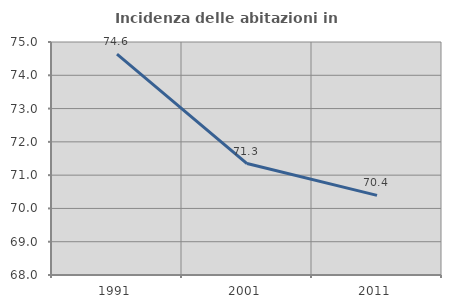
| Category | Incidenza delle abitazioni in proprietà  |
|---|---|
| 1991.0 | 74.635 |
| 2001.0 | 71.349 |
| 2011.0 | 70.392 |